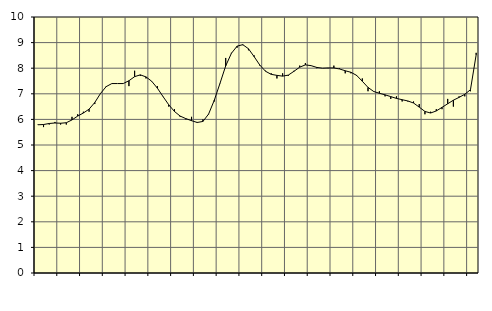
| Category | Piggar | Series 1 |
|---|---|---|
| nan | 5.8 | 5.79 |
| 1.0 | 5.7 | 5.8 |
| 1.0 | 5.8 | 5.84 |
| 1.0 | 5.9 | 5.86 |
| nan | 5.8 | 5.85 |
| 2.0 | 5.8 | 5.87 |
| 2.0 | 6.1 | 5.98 |
| 2.0 | 6.2 | 6.13 |
| nan | 6.3 | 6.25 |
| 3.0 | 6.3 | 6.4 |
| 3.0 | 6.6 | 6.66 |
| 3.0 | 7 | 7.01 |
| nan | 7.3 | 7.28 |
| 4.0 | 7.4 | 7.4 |
| 4.0 | 7.4 | 7.4 |
| 4.0 | 7.4 | 7.4 |
| nan | 7.3 | 7.51 |
| 5.0 | 7.9 | 7.67 |
| 5.0 | 7.7 | 7.74 |
| 5.0 | 7.6 | 7.66 |
| nan | 7.5 | 7.49 |
| 6.0 | 7.3 | 7.22 |
| 6.0 | 6.9 | 6.89 |
| 6.0 | 6.5 | 6.57 |
| nan | 6.4 | 6.31 |
| 7.0 | 6.1 | 6.13 |
| 7.0 | 6 | 6.03 |
| 7.0 | 6.1 | 5.95 |
| nan | 5.9 | 5.88 |
| 8.0 | 6 | 5.92 |
| 8.0 | 6.2 | 6.21 |
| 8.0 | 6.7 | 6.75 |
| nan | 7.4 | 7.41 |
| 9.0 | 8.4 | 8.09 |
| 9.0 | 8.6 | 8.58 |
| 9.0 | 8.8 | 8.86 |
| nan | 8.9 | 8.92 |
| 10.0 | 8.7 | 8.76 |
| 10.0 | 8.5 | 8.45 |
| 10.0 | 8.1 | 8.12 |
| nan | 7.9 | 7.88 |
| 11.0 | 7.8 | 7.76 |
| 11.0 | 7.6 | 7.72 |
| 11.0 | 7.8 | 7.69 |
| nan | 7.7 | 7.73 |
| 12.0 | 7.9 | 7.88 |
| 12.0 | 8.1 | 8.04 |
| 12.0 | 8.2 | 8.13 |
| nan | 8.1 | 8.1 |
| 13.0 | 8 | 8.03 |
| 13.0 | 8 | 8 |
| 13.0 | 8 | 8.01 |
| nan | 8.1 | 8.01 |
| 14.0 | 8 | 7.97 |
| 14.0 | 7.8 | 7.9 |
| 14.0 | 7.8 | 7.84 |
| nan | 7.7 | 7.72 |
| 15.0 | 7.6 | 7.49 |
| 15.0 | 7.1 | 7.25 |
| 15.0 | 7.1 | 7.09 |
| nan | 7.1 | 7.02 |
| 16.0 | 6.9 | 6.96 |
| 16.0 | 6.8 | 6.89 |
| 16.0 | 6.9 | 6.82 |
| nan | 6.7 | 6.77 |
| 17.0 | 6.7 | 6.72 |
| 17.0 | 6.7 | 6.64 |
| 17.0 | 6.6 | 6.48 |
| nan | 6.2 | 6.31 |
| 18.0 | 6.3 | 6.25 |
| 18.0 | 6.4 | 6.33 |
| 18.0 | 6.4 | 6.47 |
| nan | 6.8 | 6.61 |
| 19.0 | 6.5 | 6.75 |
| 19.0 | 6.9 | 6.86 |
| 19.0 | 6.9 | 6.98 |
| nan | 7.1 | 7.16 |
| 20.0 | 8.6 | 8.52 |